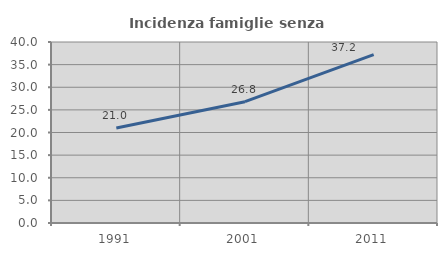
| Category | Incidenza famiglie senza nuclei |
|---|---|
| 1991.0 | 20.985 |
| 2001.0 | 26.806 |
| 2011.0 | 37.206 |